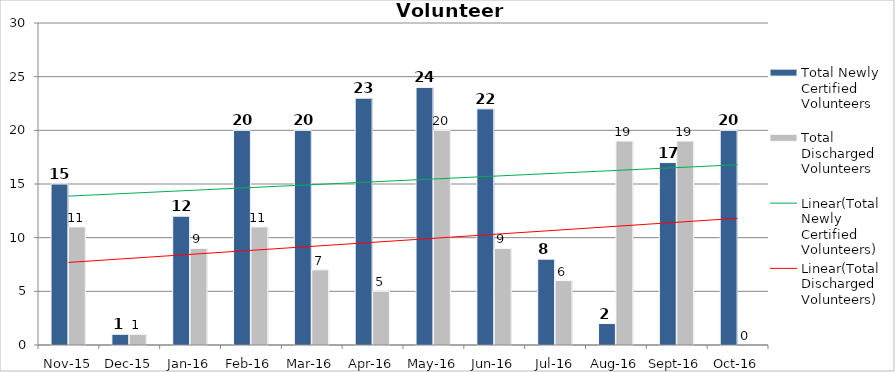
| Category | Total Newly Certified Volunteers | Total Discharged Volunteers |
|---|---|---|
| Nov-15 | 15 | 11 |
| Dec-15 | 1 | 1 |
| Jan-16 | 12 | 9 |
| Feb-16 | 20 | 11 |
| Mar-16 | 20 | 7 |
| Apr-16 | 23 | 5 |
| May-16 | 24 | 20 |
| Jun-16 | 22 | 9 |
| Jul-16 | 8 | 6 |
| Aug-16 | 2 | 19 |
| Sep-16 | 17 | 19 |
| Oct-16 | 20 | 0 |